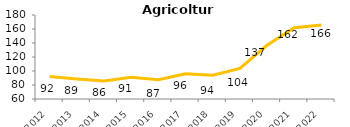
| Category | Agricoltura |
|---|---|
| 2012.0 | 92.1 |
| 2013.0 | 88.5 |
| 2014.0 | 85.6 |
| 2015.0 | 91 |
| 2016.0 | 87.4 |
| 2017.0 | 96 |
| 2018.0 | 94.1 |
| 2019.0 | 103.6 |
| 2020.0 | 136.8 |
| 2021.0 | 161.8 |
| 2022.0 | 165.7 |